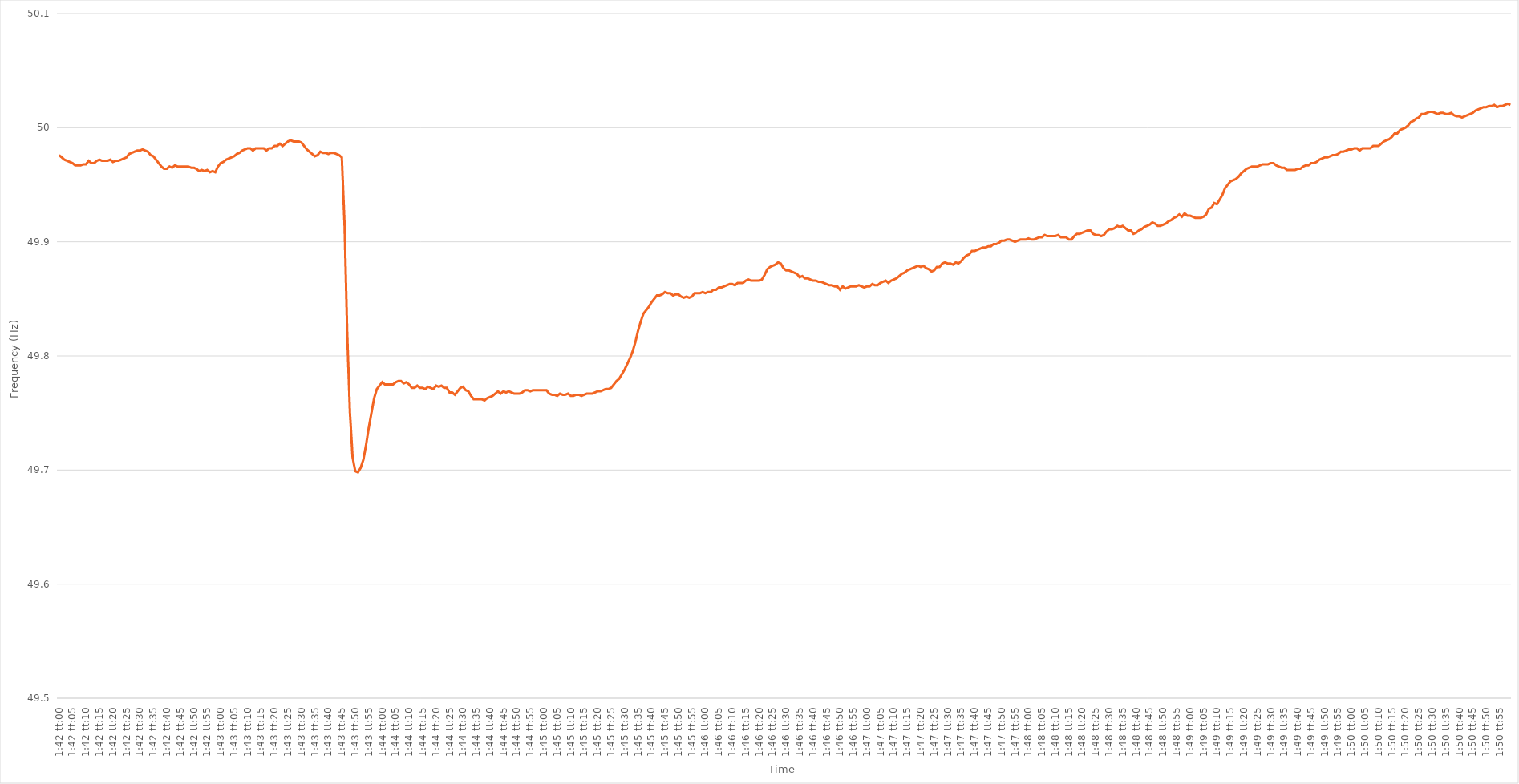
| Category | Series 0 |
|---|---|
| 0.07083333333333333 | 49.976 |
| 0.07084490740740741 | 49.974 |
| 0.07085648148148148 | 49.972 |
| 0.07086805555555555 | 49.971 |
| 0.07087962962962963 | 49.97 |
| 0.0708912037037037 | 49.969 |
| 0.07090277777777777 | 49.967 |
| 0.07091435185185185 | 49.967 |
| 0.07092592592592593 | 49.967 |
| 0.0709375 | 49.968 |
| 0.07094907407407407 | 49.968 |
| 0.07096064814814815 | 49.971 |
| 0.07097222222222223 | 49.969 |
| 0.0709837962962963 | 49.969 |
| 0.07099537037037036 | 49.971 |
| 0.07100694444444444 | 49.972 |
| 0.07101851851851852 | 49.971 |
| 0.07103009259259259 | 49.971 |
| 0.07104166666666667 | 49.971 |
| 0.07105324074074075 | 49.972 |
| 0.07106481481481482 | 49.97 |
| 0.07107638888888888 | 49.971 |
| 0.07108796296296296 | 49.971 |
| 0.07109953703703703 | 49.972 |
| 0.07111111111111111 | 49.973 |
| 0.07112268518518518 | 49.974 |
| 0.07113425925925926 | 49.977 |
| 0.07114583333333334 | 49.978 |
| 0.0711574074074074 | 49.979 |
| 0.07116898148148149 | 49.98 |
| 0.07118055555555557 | 49.98 |
| 0.07119212962962963 | 49.981 |
| 0.0712037037037037 | 49.98 |
| 0.07121527777777777 | 49.979 |
| 0.07122685185185186 | 49.976 |
| 0.07123842592592593 | 49.975 |
| 0.07125 | 49.972 |
| 0.07126157407407407 | 49.969 |
| 0.07127314814814815 | 49.966 |
| 0.07128472222222222 | 49.964 |
| 0.07129629629629629 | 49.964 |
| 0.07130787037037037 | 49.966 |
| 0.07131944444444445 | 49.965 |
| 0.07133101851851852 | 49.967 |
| 0.07134259259259258 | 49.966 |
| 0.07135416666666666 | 49.966 |
| 0.07136574074074074 | 49.966 |
| 0.07137731481481481 | 49.966 |
| 0.07138888888888889 | 49.966 |
| 0.07140046296296297 | 49.965 |
| 0.07141203703703704 | 49.965 |
| 0.07142361111111112 | 49.964 |
| 0.07143518518518518 | 49.962 |
| 0.07144675925925927 | 49.963 |
| 0.07145833333333333 | 49.962 |
| 0.0714699074074074 | 49.963 |
| 0.07148148148148148 | 49.961 |
| 0.07149305555555556 | 49.962 |
| 0.07150462962962963 | 49.961 |
| 0.0715162037037037 | 49.966 |
| 0.07152777777777779 | 49.969 |
| 0.07153935185185185 | 49.97 |
| 0.07155092592592592 | 49.972 |
| 0.07156249999999999 | 49.973 |
| 0.07157407407407408 | 49.974 |
| 0.07158564814814815 | 49.975 |
| 0.07159722222222221 | 49.977 |
| 0.0716087962962963 | 49.978 |
| 0.07162037037037038 | 49.98 |
| 0.07163194444444444 | 49.981 |
| 0.07164351851851852 | 49.982 |
| 0.07165509259259259 | 49.982 |
| 0.07166666666666667 | 49.98 |
| 0.07167824074074074 | 49.982 |
| 0.07168981481481482 | 49.982 |
| 0.07170138888888888 | 49.982 |
| 0.07171296296296296 | 49.982 |
| 0.07172453703703703 | 49.98 |
| 0.07173611111111111 | 49.982 |
| 0.07174768518518519 | 49.982 |
| 0.07175925925925926 | 49.984 |
| 0.07177083333333334 | 49.984 |
| 0.0717824074074074 | 49.986 |
| 0.07179398148148149 | 49.984 |
| 0.07180555555555555 | 49.986 |
| 0.07181712962962962 | 49.988 |
| 0.0718287037037037 | 49.989 |
| 0.07184027777777778 | 49.988 |
| 0.07185185185185185 | 49.988 |
| 0.07186342592592593 | 49.988 |
| 0.07187500000000001 | 49.987 |
| 0.07188657407407407 | 49.984 |
| 0.07189814814814814 | 49.981 |
| 0.07190972222222222 | 49.979 |
| 0.0719212962962963 | 49.977 |
| 0.07193287037037037 | 49.975 |
| 0.07194444444444444 | 49.976 |
| 0.07195601851851852 | 49.979 |
| 0.0719675925925926 | 49.978 |
| 0.07197916666666666 | 49.978 |
| 0.07199074074074074 | 49.977 |
| 0.07200231481481481 | 49.978 |
| 0.07201388888888889 | 49.978 |
| 0.07202546296296296 | 49.977 |
| 0.07203703703703704 | 49.976 |
| 0.0720486111111111 | 49.974 |
| 0.07206018518518519 | 49.916 |
| 0.07207175925925925 | 49.82 |
| 0.07208333333333333 | 49.751 |
| 0.07209490740740741 | 49.711 |
| 0.07210648148148148 | 49.699 |
| 0.07211805555555556 | 49.698 |
| 0.07212962962962964 | 49.702 |
| 0.07214120370370371 | 49.709 |
| 0.07215277777777777 | 49.722 |
| 0.07216435185185184 | 49.737 |
| 0.07217592592592592 | 49.75 |
| 0.0721875 | 49.763 |
| 0.07219907407407407 | 49.771 |
| 0.07221064814814815 | 49.774 |
| 0.07222222222222223 | 49.777 |
| 0.0722337962962963 | 49.775 |
| 0.07224537037037036 | 49.775 |
| 0.07225694444444444 | 49.775 |
| 0.07226851851851852 | 49.775 |
| 0.07228009259259259 | 49.777 |
| 0.07229166666666666 | 49.778 |
| 0.07230324074074074 | 49.778 |
| 0.07231481481481482 | 49.776 |
| 0.07232638888888888 | 49.777 |
| 0.07233796296296297 | 49.775 |
| 0.07234953703703705 | 49.772 |
| 0.07236111111111111 | 49.772 |
| 0.07237268518518519 | 49.774 |
| 0.07238425925925926 | 49.772 |
| 0.07239583333333334 | 49.772 |
| 0.0724074074074074 | 49.771 |
| 0.07241898148148147 | 49.773 |
| 0.07243055555555555 | 49.772 |
| 0.07244212962962963 | 49.771 |
| 0.0724537037037037 | 49.774 |
| 0.07246527777777778 | 49.773 |
| 0.07247685185185186 | 49.774 |
| 0.07248842592592593 | 49.772 |
| 0.0725 | 49.772 |
| 0.07251157407407406 | 49.768 |
| 0.07252314814814814 | 49.768 |
| 0.07253472222222222 | 49.766 |
| 0.07254629629629629 | 49.769 |
| 0.07255787037037037 | 49.772 |
| 0.07256944444444445 | 49.773 |
| 0.07258101851851852 | 49.77 |
| 0.0725925925925926 | 49.769 |
| 0.07260416666666666 | 49.765 |
| 0.07261574074074074 | 49.762 |
| 0.07262731481481481 | 49.762 |
| 0.07263888888888889 | 49.762 |
| 0.07265046296296296 | 49.762 |
| 0.07266203703703704 | 49.761 |
| 0.0726736111111111 | 49.763 |
| 0.07268518518518519 | 49.764 |
| 0.07269675925925927 | 49.765 |
| 0.07270833333333333 | 49.767 |
| 0.07271990740740741 | 49.769 |
| 0.07273148148148148 | 49.767 |
| 0.07274305555555556 | 49.769 |
| 0.07275462962962963 | 49.768 |
| 0.0727662037037037 | 49.769 |
| 0.07277777777777777 | 49.768 |
| 0.07278935185185186 | 49.767 |
| 0.07280092592592592 | 49.767 |
| 0.0728125 | 49.767 |
| 0.07282407407407408 | 49.768 |
| 0.07283564814814815 | 49.77 |
| 0.07284722222222222 | 49.77 |
| 0.0728587962962963 | 49.769 |
| 0.07287037037037036 | 49.77 |
| 0.07288194444444444 | 49.77 |
| 0.07289351851851851 | 49.77 |
| 0.07290509259259259 | 49.77 |
| 0.07291666666666667 | 49.77 |
| 0.07292824074074074 | 49.77 |
| 0.07293981481481482 | 49.767 |
| 0.07295138888888889 | 49.766 |
| 0.07296296296296297 | 49.766 |
| 0.07297453703703703 | 49.765 |
| 0.07298611111111111 | 49.767 |
| 0.07299768518518518 | 49.766 |
| 0.07300925925925926 | 49.766 |
| 0.07302083333333333 | 49.767 |
| 0.07303240740740741 | 49.765 |
| 0.07304398148148149 | 49.765 |
| 0.07305555555555555 | 49.766 |
| 0.07306712962962963 | 49.766 |
| 0.07307870370370372 | 49.765 |
| 0.07309027777777778 | 49.766 |
| 0.07310185185185185 | 49.767 |
| 0.07311342592592592 | 49.767 |
| 0.073125 | 49.767 |
| 0.07313657407407408 | 49.768 |
| 0.07314814814814814 | 49.769 |
| 0.07315972222222222 | 49.769 |
| 0.0731712962962963 | 49.77 |
| 0.07318287037037037 | 49.771 |
| 0.07319444444444444 | 49.771 |
| 0.07320601851851852 | 49.772 |
| 0.07321759259259258 | 49.775 |
| 0.07322916666666666 | 49.778 |
| 0.07324074074074073 | 49.78 |
| 0.07325231481481481 | 49.784 |
| 0.07326388888888889 | 49.788 |
| 0.07327546296296296 | 49.793 |
| 0.07328703703703704 | 49.798 |
| 0.07329861111111112 | 49.804 |
| 0.07331018518518519 | 49.812 |
| 0.07332175925925927 | 49.822 |
| 0.07333333333333333 | 49.83 |
| 0.07334490740740741 | 49.837 |
| 0.07335648148148148 | 49.84 |
| 0.07336805555555555 | 49.843 |
| 0.07337962962962963 | 49.847 |
| 0.07339120370370371 | 49.85 |
| 0.07340277777777778 | 49.853 |
| 0.07341435185185186 | 49.853 |
| 0.07342592592592594 | 49.854 |
| 0.0734375 | 49.856 |
| 0.07344907407407407 | 49.855 |
| 0.07346064814814814 | 49.855 |
| 0.07347222222222222 | 49.853 |
| 0.0734837962962963 | 49.854 |
| 0.07349537037037036 | 49.854 |
| 0.07350694444444444 | 49.852 |
| 0.07351851851851852 | 49.851 |
| 0.07353009259259259 | 49.852 |
| 0.07354166666666667 | 49.851 |
| 0.07355324074074074 | 49.852 |
| 0.07356481481481482 | 49.855 |
| 0.07357638888888889 | 49.855 |
| 0.07358796296296297 | 49.855 |
| 0.07359953703703703 | 49.856 |
| 0.07361111111111111 | 49.855 |
| 0.07362268518518518 | 49.856 |
| 0.07363425925925926 | 49.856 |
| 0.07364583333333334 | 49.858 |
| 0.07365740740740741 | 49.858 |
| 0.07366898148148149 | 49.86 |
| 0.07368055555555555 | 49.86 |
| 0.07369212962962964 | 49.861 |
| 0.0737037037037037 | 49.862 |
| 0.07371527777777777 | 49.863 |
| 0.07372685185185185 | 49.863 |
| 0.07373842592592593 | 49.862 |
| 0.07375 | 49.864 |
| 0.07376157407407408 | 49.864 |
| 0.07377314814814816 | 49.864 |
| 0.07378472222222222 | 49.866 |
| 0.07379629629629629 | 49.867 |
| 0.07380787037037037 | 49.866 |
| 0.07381944444444444 | 49.866 |
| 0.07383101851851852 | 49.866 |
| 0.07384259259259258 | 49.866 |
| 0.07385416666666667 | 49.867 |
| 0.07386574074074075 | 49.871 |
| 0.07387731481481481 | 49.876 |
| 0.07388888888888889 | 49.878 |
| 0.07390046296296296 | 49.879 |
| 0.07391203703703704 | 49.88 |
| 0.0739236111111111 | 49.882 |
| 0.07393518518518519 | 49.881 |
| 0.07394675925925925 | 49.877 |
| 0.07395833333333333 | 49.875 |
| 0.0739699074074074 | 49.875 |
| 0.07398148148148148 | 49.874 |
| 0.07399305555555556 | 49.873 |
| 0.07400462962962963 | 49.872 |
| 0.07401620370370371 | 49.869 |
| 0.07402777777777779 | 49.87 |
| 0.07403935185185186 | 49.868 |
| 0.07405092592592592 | 49.868 |
| 0.07406249999999999 | 49.867 |
| 0.07407407407407407 | 49.866 |
| 0.07408564814814815 | 49.866 |
| 0.07409722222222222 | 49.865 |
| 0.0741087962962963 | 49.865 |
| 0.07412037037037038 | 49.864 |
| 0.07413194444444444 | 49.863 |
| 0.07414351851851851 | 49.862 |
| 0.07415509259259259 | 49.862 |
| 0.07416666666666666 | 49.861 |
| 0.07417824074074074 | 49.861 |
| 0.0741898148148148 | 49.858 |
| 0.07420138888888889 | 49.861 |
| 0.07421296296296297 | 49.859 |
| 0.07422453703703703 | 49.86 |
| 0.07423611111111111 | 49.861 |
| 0.0742476851851852 | 49.861 |
| 0.07425925925925926 | 49.861 |
| 0.07427083333333334 | 49.862 |
| 0.07428240740740741 | 49.861 |
| 0.07429398148148149 | 49.86 |
| 0.07430555555555556 | 49.861 |
| 0.07431712962962962 | 49.861 |
| 0.0743287037037037 | 49.863 |
| 0.07434027777777778 | 49.862 |
| 0.07435185185185185 | 49.862 |
| 0.07436342592592593 | 49.864 |
| 0.07437500000000001 | 49.865 |
| 0.07438657407407408 | 49.866 |
| 0.07439814814814814 | 49.864 |
| 0.07440972222222221 | 49.866 |
| 0.07442129629629629 | 49.867 |
| 0.07443287037037037 | 49.868 |
| 0.07444444444444444 | 49.87 |
| 0.07445601851851852 | 49.872 |
| 0.0744675925925926 | 49.873 |
| 0.07447916666666667 | 49.875 |
| 0.07449074074074075 | 49.876 |
| 0.07450231481481481 | 49.877 |
| 0.0745138888888889 | 49.878 |
| 0.07452546296296296 | 49.879 |
| 0.07453703703703704 | 49.878 |
| 0.07454861111111111 | 49.879 |
| 0.07456018518518519 | 49.877 |
| 0.07457175925925925 | 49.876 |
| 0.07458333333333333 | 49.874 |
| 0.07459490740740742 | 49.875 |
| 0.07460648148148148 | 49.878 |
| 0.07461805555555556 | 49.878 |
| 0.07462962962962963 | 49.881 |
| 0.07464120370370371 | 49.882 |
| 0.07465277777777778 | 49.881 |
| 0.07466435185185184 | 49.881 |
| 0.07467592592592592 | 49.88 |
| 0.0746875 | 49.882 |
| 0.07469907407407407 | 49.881 |
| 0.07471064814814815 | 49.883 |
| 0.07472222222222223 | 49.886 |
| 0.0747337962962963 | 49.888 |
| 0.07474537037037036 | 49.889 |
| 0.07475694444444445 | 49.892 |
| 0.07476851851851851 | 49.892 |
| 0.07478009259259259 | 49.893 |
| 0.07479166666666666 | 49.894 |
| 0.07480324074074074 | 49.895 |
| 0.07481481481481482 | 49.895 |
| 0.07482638888888889 | 49.896 |
| 0.07483796296296297 | 49.896 |
| 0.07484953703703703 | 49.898 |
| 0.07486111111111111 | 49.898 |
| 0.07487268518518518 | 49.899 |
| 0.07488425925925926 | 49.901 |
| 0.07489583333333333 | 49.901 |
| 0.07490740740740741 | 49.902 |
| 0.07491898148148148 | 49.902 |
| 0.07493055555555556 | 49.901 |
| 0.07494212962962964 | 49.9 |
| 0.0749537037037037 | 49.901 |
| 0.07496527777777778 | 49.902 |
| 0.07497685185185186 | 49.902 |
| 0.07498842592592593 | 49.902 |
| 0.075 | 49.903 |
| 0.07501157407407406 | 49.902 |
| 0.07502314814814814 | 49.902 |
| 0.07503472222222222 | 49.903 |
| 0.07504629629629629 | 49.904 |
| 0.07505787037037037 | 49.904 |
| 0.07506944444444445 | 49.906 |
| 0.07508101851851852 | 49.905 |
| 0.07509259259259259 | 49.905 |
| 0.07510416666666667 | 49.905 |
| 0.07511574074074073 | 49.905 |
| 0.07512731481481481 | 49.906 |
| 0.07513888888888888 | 49.904 |
| 0.07515046296296296 | 49.904 |
| 0.07516203703703704 | 49.904 |
| 0.07517361111111111 | 49.902 |
| 0.07518518518518519 | 49.902 |
| 0.07519675925925927 | 49.905 |
| 0.07520833333333334 | 49.907 |
| 0.07521990740740742 | 49.907 |
| 0.07523148148148148 | 49.908 |
| 0.07524305555555556 | 49.909 |
| 0.07525462962962963 | 49.91 |
| 0.0752662037037037 | 49.91 |
| 0.07527777777777778 | 49.907 |
| 0.07528935185185186 | 49.906 |
| 0.07530092592592592 | 49.906 |
| 0.0753125 | 49.905 |
| 0.07532407407407408 | 49.906 |
| 0.07533564814814815 | 49.909 |
| 0.07534722222222222 | 49.911 |
| 0.07535879629629628 | 49.911 |
| 0.07537037037037037 | 49.912 |
| 0.07538194444444445 | 49.914 |
| 0.07539351851851851 | 49.913 |
| 0.07540509259259259 | 49.914 |
| 0.07541666666666667 | 49.912 |
| 0.07542824074074074 | 49.91 |
| 0.07543981481481482 | 49.91 |
| 0.07545138888888889 | 49.907 |
| 0.07546296296296297 | 49.908 |
| 0.07547453703703703 | 49.91 |
| 0.07548611111111111 | 49.911 |
| 0.07549768518518518 | 49.913 |
| 0.07550925925925926 | 49.914 |
| 0.07552083333333333 | 49.915 |
| 0.07553240740740741 | 49.917 |
| 0.07554398148148149 | 49.916 |
| 0.07555555555555556 | 49.914 |
| 0.07556712962962964 | 49.914 |
| 0.0755787037037037 | 49.915 |
| 0.07559027777777778 | 49.916 |
| 0.07560185185185185 | 49.918 |
| 0.07561342592592592 | 49.919 |
| 0.075625 | 49.921 |
| 0.07563657407407408 | 49.922 |
| 0.07564814814814814 | 49.924 |
| 0.07565972222222223 | 49.922 |
| 0.0756712962962963 | 49.925 |
| 0.07568287037037037 | 49.923 |
| 0.07569444444444444 | 49.923 |
| 0.07570601851851852 | 49.922 |
| 0.07571759259259259 | 49.921 |
| 0.07572916666666667 | 49.921 |
| 0.07574074074074073 | 49.921 |
| 0.07575231481481481 | 49.922 |
| 0.0757638888888889 | 49.924 |
| 0.07577546296296296 | 49.929 |
| 0.07578703703703704 | 49.93 |
| 0.07579861111111111 | 49.934 |
| 0.07581018518518519 | 49.933 |
| 0.07582175925925926 | 49.937 |
| 0.07583333333333334 | 49.941 |
| 0.0758449074074074 | 49.947 |
| 0.07585648148148148 | 49.95 |
| 0.07586805555555555 | 49.953 |
| 0.07587962962962963 | 49.954 |
| 0.07589120370370371 | 49.955 |
| 0.07590277777777778 | 49.957 |
| 0.07591435185185186 | 49.96 |
| 0.07592592592592594 | 49.962 |
| 0.0759375 | 49.964 |
| 0.07594907407407407 | 49.965 |
| 0.07596064814814814 | 49.966 |
| 0.07597222222222222 | 49.966 |
| 0.0759837962962963 | 49.966 |
| 0.07599537037037037 | 49.967 |
| 0.07600694444444445 | 49.968 |
| 0.07601851851851853 | 49.968 |
| 0.0760300925925926 | 49.968 |
| 0.07604166666666666 | 49.969 |
| 0.07605324074074074 | 49.969 |
| 0.07606481481481481 | 49.967 |
| 0.07607638888888889 | 49.966 |
| 0.07608796296296295 | 49.965 |
| 0.07609953703703703 | 49.965 |
| 0.07611111111111112 | 49.963 |
| 0.07612268518518518 | 49.963 |
| 0.07613425925925926 | 49.963 |
| 0.07614583333333334 | 49.963 |
| 0.07615740740740741 | 49.964 |
| 0.07616898148148148 | 49.964 |
| 0.07618055555555556 | 49.966 |
| 0.07619212962962964 | 49.967 |
| 0.0762037037037037 | 49.967 |
| 0.07621527777777777 | 49.969 |
| 0.07622685185185185 | 49.969 |
| 0.07623842592592593 | 49.97 |
| 0.07625 | 49.972 |
| 0.07626157407407408 | 49.973 |
| 0.07627314814814816 | 49.974 |
| 0.07628472222222223 | 49.974 |
| 0.07629629629629629 | 49.975 |
| 0.07630787037037036 | 49.976 |
| 0.07631944444444444 | 49.976 |
| 0.07633101851851852 | 49.977 |
| 0.07634259259259259 | 49.979 |
| 0.07635416666666667 | 49.979 |
| 0.07636574074074075 | 49.98 |
| 0.07637731481481481 | 49.981 |
| 0.0763888888888889 | 49.981 |
| 0.07640046296296296 | 49.982 |
| 0.07641203703703704 | 49.982 |
| 0.07642361111111111 | 49.98 |
| 0.07643518518518519 | 49.982 |
| 0.07644675925925926 | 49.982 |
| 0.07645833333333334 | 49.982 |
| 0.0764699074074074 | 49.982 |
| 0.07648148148148148 | 49.984 |
| 0.07649305555555556 | 49.984 |
| 0.07650462962962963 | 49.984 |
| 0.0765162037037037 | 49.986 |
| 0.07652777777777778 | 49.988 |
| 0.07653935185185186 | 49.989 |
| 0.07655092592592593 | 49.99 |
| 0.07656249999999999 | 49.992 |
| 0.07657407407407407 | 49.995 |
| 0.07658564814814815 | 49.995 |
| 0.07659722222222222 | 49.998 |
| 0.0766087962962963 | 49.999 |
| 0.07662037037037038 | 50 |
| 0.07663194444444445 | 50.002 |
| 0.07664351851851851 | 50.005 |
| 0.0766550925925926 | 50.006 |
| 0.07666666666666666 | 50.008 |
| 0.07667824074074074 | 50.009 |
| 0.07668981481481481 | 50.012 |
| 0.07670138888888889 | 50.012 |
| 0.07671296296296297 | 50.013 |
| 0.07672453703703704 | 50.014 |
| 0.07673611111111112 | 50.014 |
| 0.07674768518518518 | 50.013 |
| 0.07675925925925926 | 50.012 |
| 0.07677083333333333 | 50.013 |
| 0.07678240740740741 | 50.013 |
| 0.07679398148148148 | 50.012 |
| 0.07680555555555556 | 50.012 |
| 0.07681712962962962 | 50.013 |
| 0.0768287037037037 | 50.011 |
| 0.07684027777777779 | 50.01 |
| 0.07685185185185185 | 50.01 |
| 0.07686342592592592 | 50.009 |
| 0.07687500000000001 | 50.01 |
| 0.07688657407407408 | 50.011 |
| 0.07689814814814815 | 50.012 |
| 0.07690972222222221 | 50.013 |
| 0.0769212962962963 | 50.015 |
| 0.07693287037037037 | 50.016 |
| 0.07694444444444444 | 50.017 |
| 0.07695601851851852 | 50.018 |
| 0.0769675925925926 | 50.018 |
| 0.07697916666666667 | 50.019 |
| 0.07699074074074073 | 50.019 |
| 0.07700231481481482 | 50.02 |
| 0.07701388888888888 | 50.018 |
| 0.07702546296296296 | 50.019 |
| 0.07703703703703703 | 50.019 |
| 0.07704861111111111 | 50.02 |
| 0.07706018518518519 | 50.021 |
| 0.07707175925925926 | 50.02 |